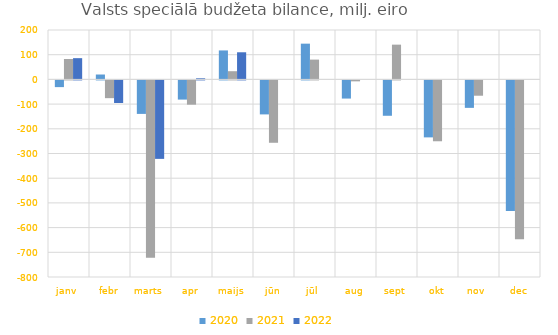
| Category | 2020 | 2021 | 2022 |
|---|---|---|---|
| janv | -27208.622 | 82687.376 | 85977.566 |
| febr | 19788.686 | -71897.87 | -91449.582 |
| marts | -135656.538 | -718456.648 | -317726.304 |
| apr | -77693.159 | -98266.92 | 4462.198 |
| maijs | 117283.375 | 33166.776 | 109820.92 |
| jūn | -137664.742 | -252544.202 | 0 |
| jūl | 144716.055 | 80130.309 | 0 |
| aug | -73544.568 | -3849.803 | 0 |
| sept | -143217.051 | 140699.512 | 0 |
| okt | -230687.141 | -246404.654 | 0 |
| nov | -111188.747 | -62022.59 | 0 |
| dec | -529219.01 | -643593.594 | 0 |